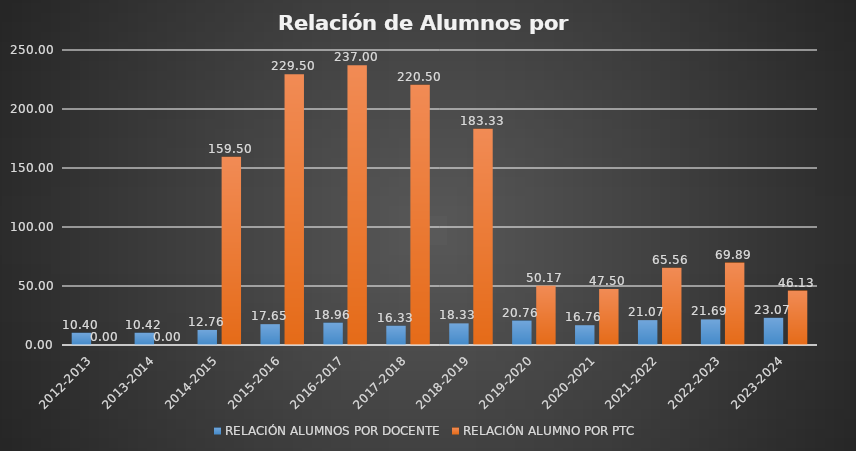
| Category | RELACIÓN ALUMNOS POR DOCENTE | RELACIÓN ALUMNO POR PTC |
|---|---|---|
| 2012-2013 | 10.4 | 0 |
| 2013-2014 | 10.421 | 0 |
| 2014-2015 | 12.76 | 159.5 |
| 2015-2016 | 17.654 | 229.5 |
| 2016-2017 | 18.96 | 237 |
| 2017-2018 | 16.333 | 220.5 |
| 2018-2019 | 18.333 | 183.333 |
| 2019-2020 | 20.759 | 50.167 |
| 2020-2021 | 16.765 | 47.5 |
| 2021-2022 | 21.071 | 65.556 |
| 2022-2023 | 21.69 | 69.889 |
| 2023-2024 | 23.067 | 46.133 |